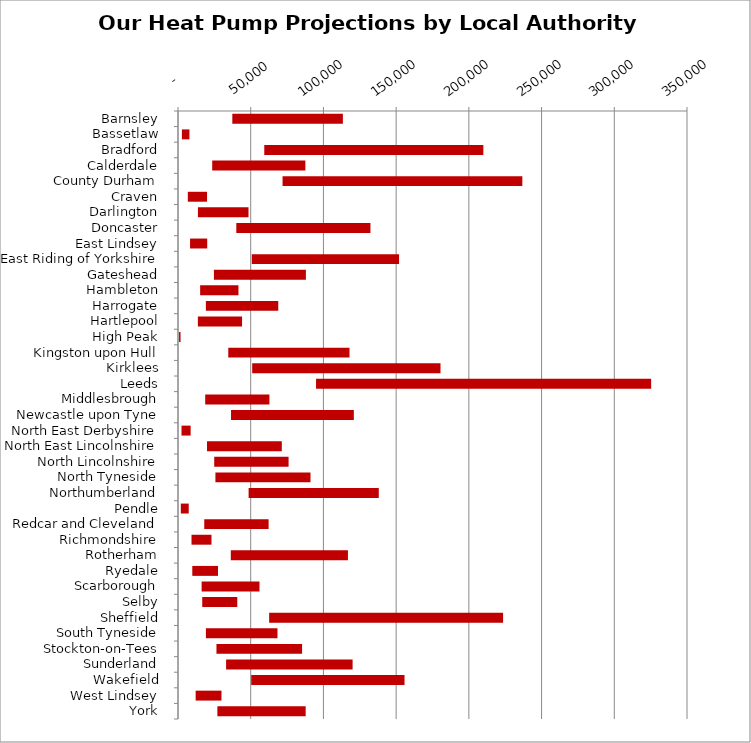
| Category | MIN | MAX |
|---|---|---|
| Barnsley | 37354 | 76015 |
| Bassetlaw | 2668 | 5200 |
| Bradford | 59325 | 150643 |
| Calderdale | 23523 | 64057 |
| County Durham | 71901 | 164878 |
| Craven | 6753 | 13217 |
| Darlington | 13696 | 34795 |
| Doncaster | 40098 | 92234 |
| East Lindsey | 8288 | 11805 |
| East Riding of Yorkshire | 50754 | 101255 |
| Gateshead | 24703 | 63249 |
| Hambleton | 15232 | 26334 |
| Harrogate | 19158 | 49786 |
| Hartlepool | 13657 | 30395 |
| High Peak | 712 | 1031 |
| Kingston upon Hull | 34573 | 83355 |
| Kirklees | 51018 | 129487 |
| Leeds | 94923 | 230429 |
| Middlesbrough | 18713 | 44150 |
| Newcastle upon Tyne | 36459 | 84449 |
| North East Derbyshire | 2416 | 6273 |
| North East Lincolnshire | 19946 | 51435 |
| North Lincolnshire | 24908 | 51131 |
| North Tyneside | 25727 | 65378 |
| Northumberland | 48554 | 89507 |
| Pendle | 1934 | 5443 |
| Redcar and Cleveland | 18052 | 44257 |
| Richmondshire | 9289 | 13741 |
| Rotherham | 36317 | 80538 |
| Ryedale | 9830 | 17678 |
| Scarborough | 16255 | 39781 |
| Selby | 16667 | 24099 |
| Sheffield | 62678 | 160853 |
| South Tyneside | 19188 | 49220 |
| Stockton-on-Tees | 26445 | 58879 |
| Sunderland | 33072 | 86985 |
| Wakefield | 50345 | 105416 |
| West Lindsey | 12137 | 17761 |
| York | 27079 | 60702 |